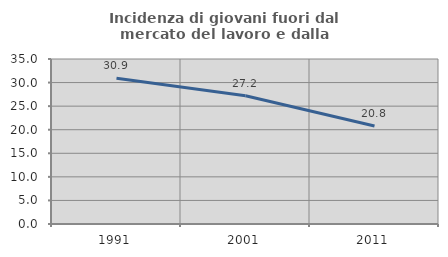
| Category | Incidenza di giovani fuori dal mercato del lavoro e dalla formazione  |
|---|---|
| 1991.0 | 30.902 |
| 2001.0 | 27.188 |
| 2011.0 | 20.794 |